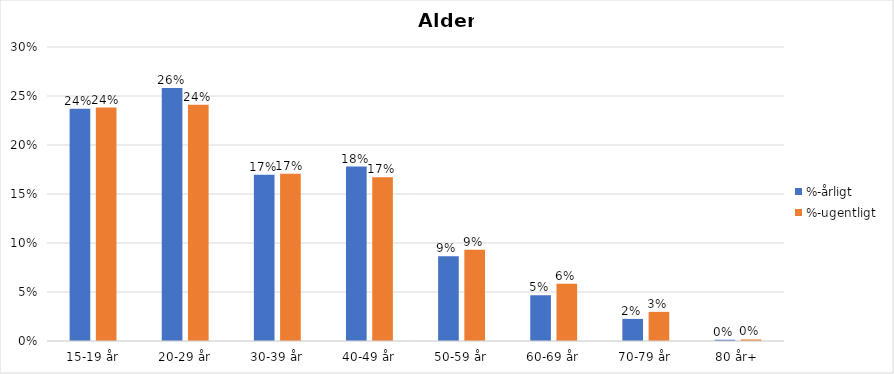
| Category | %-årligt | %-ugentligt |
|---|---|---|
| 15-19 år | 0.237 | 0.238 |
| 20-29 år | 0.258 | 0.241 |
| 30-39 år | 0.17 | 0.171 |
| 40-49 år | 0.178 | 0.167 |
| 50-59 år | 0.087 | 0.093 |
| 60-69 år | 0.047 | 0.058 |
| 70-79 år | 0.023 | 0.03 |
| 80 år+ | 0.001 | 0.002 |